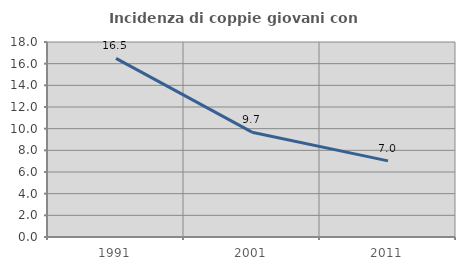
| Category | Incidenza di coppie giovani con figli |
|---|---|
| 1991.0 | 16.492 |
| 2001.0 | 9.677 |
| 2011.0 | 7.029 |